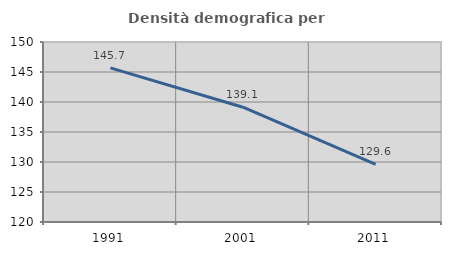
| Category | Densità demografica |
|---|---|
| 1991.0 | 145.686 |
| 2001.0 | 139.128 |
| 2011.0 | 129.592 |